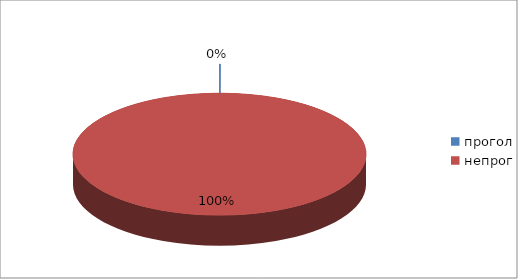
| Category | Series 0 |
|---|---|
| прогол | 2 |
| непрог | 3007 |